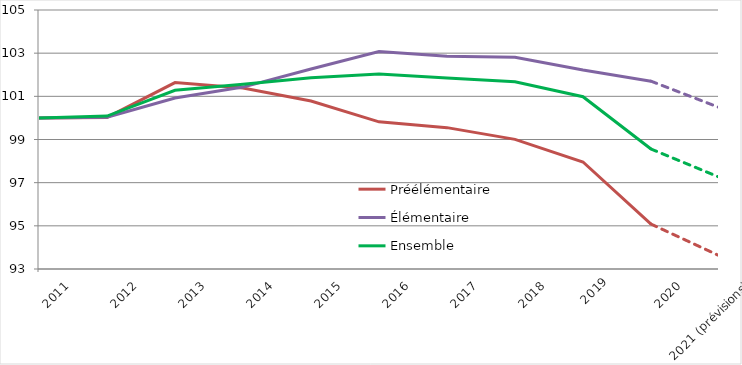
| Category | Préélémentaire | Élémentaire | Ensemble |
|---|---|---|---|
| 2011 | 100 | 100 | 100 |
| 2012 | 100.024 | 100.033 | 100.085 |
| 2013 | 101.638 | 100.921 | 101.283 |
| 2014 | 101.385 | 101.429 | 101.555 |
| 2015 | 100.785 | 102.263 | 101.864 |
| 2016 | 99.819 | 103.074 | 102.039 |
| 2017 | 99.549 | 102.854 | 101.853 |
| 2018 | 99.005 | 102.813 | 101.676 |
| 2019
 | 97.959 | 102.217 | 100.981 |
| 2020 | 95.081 | 101.702 | 98.558 |
| 2021 (prévisions) | 93.622 | 100.487 | 97.26 |